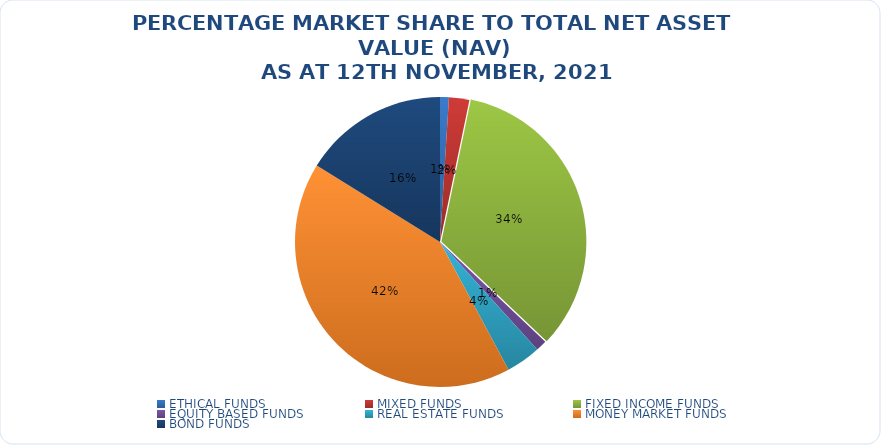
| Category | NET ASSET VALUE |
|---|---|
| ETHICAL FUNDS | 12788507023.35 |
| MIXED FUNDS | 29518294585.9 |
| FIXED INCOME FUNDS | 439284578713.865 |
| EQUITY BASED FUNDS | 16130377513.4 |
| REAL ESTATE FUNDS | 50149782982.59 |
| MONEY MARKET FUNDS | 541459981458.35 |
| BOND FUNDS | 210007834295.581 |